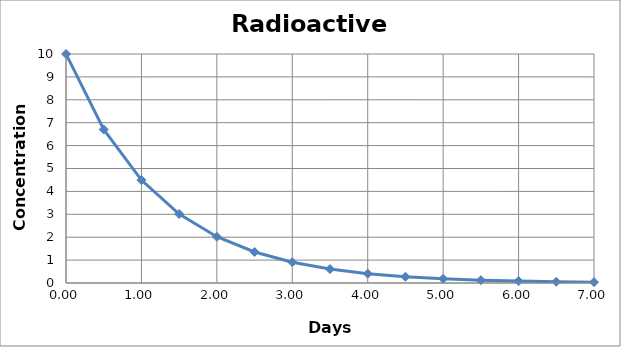
| Category | Series 0 |
|---|---|
| 0.0 | 10 |
| 0.5 | 6.703 |
| 1.0 | 4.493 |
| 1.5 | 3.012 |
| 2.0 | 2.019 |
| 2.5 | 1.353 |
| 3.0 | 0.907 |
| 3.5 | 0.608 |
| 4.0 | 0.408 |
| 4.5 | 0.273 |
| 5.0 | 0.183 |
| 5.5 | 0.123 |
| 6.0 | 0.082 |
| 6.5 | 0.055 |
| 7.0 | 0.037 |